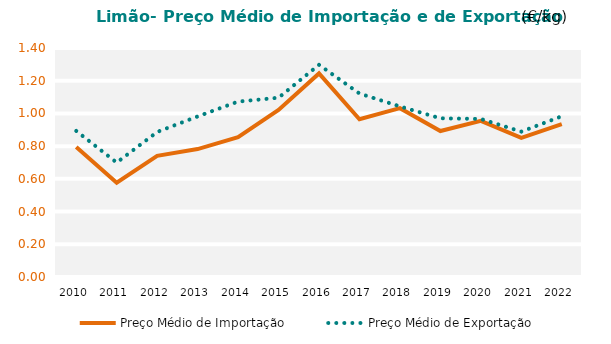
| Category | Preço Médio de Importação | Preço Médio de Exportação |
|---|---|---|
| 2010.0 | 0.795 | 0.893 |
| 2011.0 | 0.576 | 0.699 |
| 2012.0 | 0.741 | 0.887 |
| 2013.0 | 0.782 | 0.982 |
| 2014.0 | 0.856 | 1.072 |
| 2015.0 | 1.021 | 1.096 |
| 2016.0 | 1.244 | 1.297 |
| 2017.0 | 0.964 | 1.122 |
| 2018.0 | 1.032 | 1.043 |
| 2019.0 | 0.892 | 0.97 |
| 2020.0 | 0.955 | 0.966 |
| 2021.0 | 0.85 | 0.889 |
| 2022.0 | 0.935 | 0.983 |